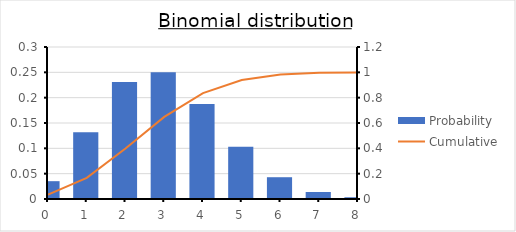
| Category | Probability |
|---|---|
| 0.0 | 0.035 |
| 1.0 | 0.132 |
| 2.0 | 0.231 |
| 3.0 | 0.25 |
| 4.0 | 0.188 |
| 5.0 | 0.103 |
| 6.0 | 0.043 |
| 7.0 | 0.014 |
| 8.0 | 0.003 |